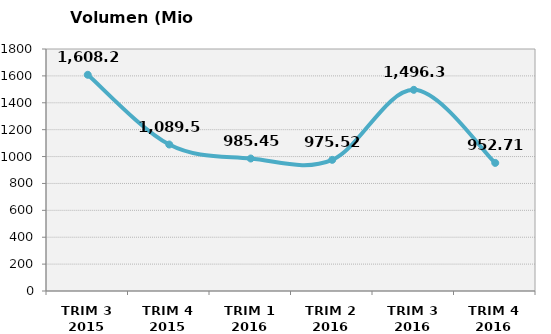
| Category | Volumen (Mio consumiciones) |
|---|---|
| TRIM 3 2015 | 1608.226 |
| TRIM 4 2015 | 1089.515 |
| TRIM 1 2016 | 985.447 |
| TRIM 2 2016 | 975.525 |
| TRIM 3 2016 | 1496.312 |
| TRIM 4 2016 | 952.712 |